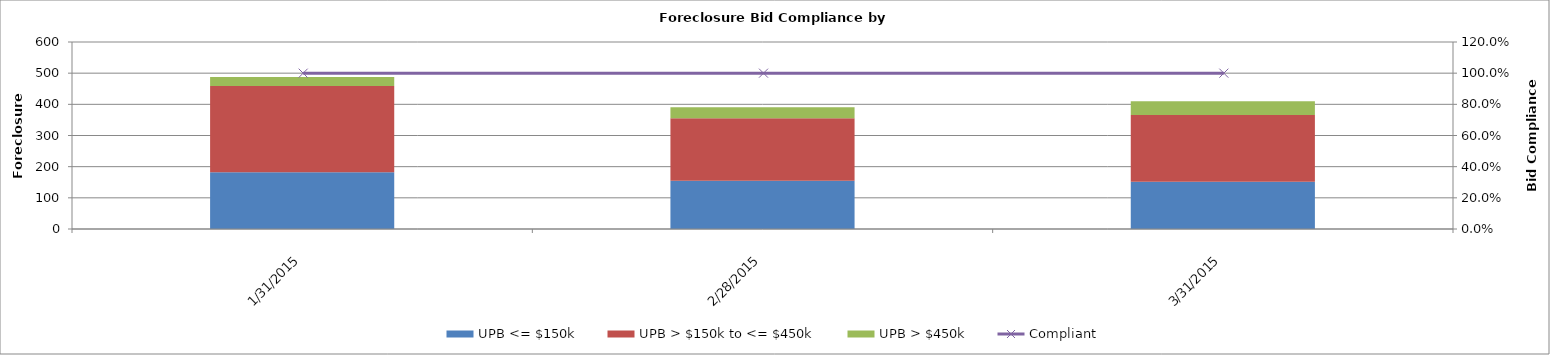
| Category | UPB <= $150k | UPB > $150k to <= $450k | UPB > $450k |
|---|---|---|---|
| 1/31/15 | 182 | 277 | 29 |
| 2/28/15 | 155 | 200 | 36 |
| 3/31/15 | 152 | 214 | 44 |